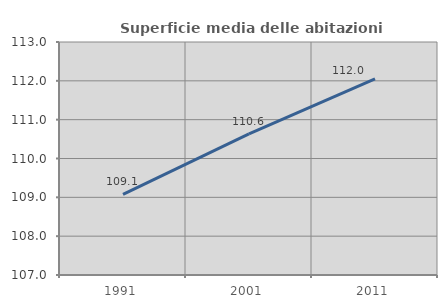
| Category | Superficie media delle abitazioni occupate |
|---|---|
| 1991.0 | 109.079 |
| 2001.0 | 110.633 |
| 2011.0 | 112.049 |